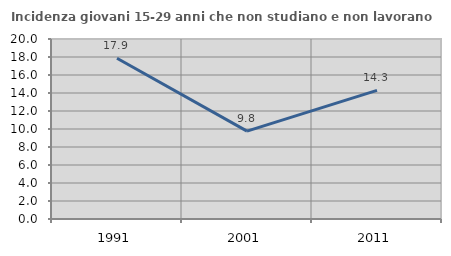
| Category | Incidenza giovani 15-29 anni che non studiano e non lavorano  |
|---|---|
| 1991.0 | 17.857 |
| 2001.0 | 9.768 |
| 2011.0 | 14.289 |